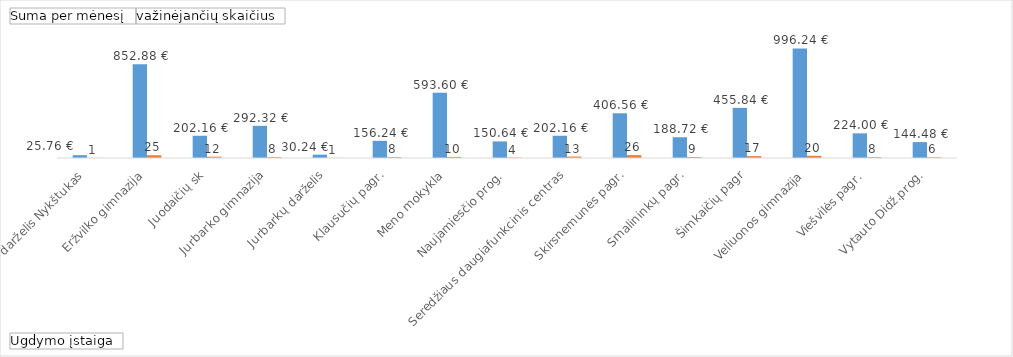
| Category | Suma per mėnesį | važinėjančių skaičius |
|---|---|---|
|  darželis Nykštukas | 25.76 | 1 |
| Eržvilko gimnazija | 852.88 | 25 |
| Juodaičių sk | 202.16 | 12 |
| Jurbarko gimnazija | 292.32 | 8 |
| Jurbarkų darželis | 30.24 | 1 |
| Klausučių pagr. | 156.24 | 8 |
| Meno mokykla | 593.6 | 10 |
| Naujamiesčio prog. | 150.64 | 4 |
| Seredžiaus daugiafunkcinis centras | 202.16 | 13 |
| Skirsnemunės pagr. | 406.56 | 26 |
| Smalininkų pagr. | 188.72 | 9 |
| Šimkaičių pagr | 455.84 | 17 |
| Veliuonos gimnazija | 996.24 | 20 |
| Viešvilės pagr. | 224 | 8 |
| Vytauto Didž.prog. | 144.48 | 6 |